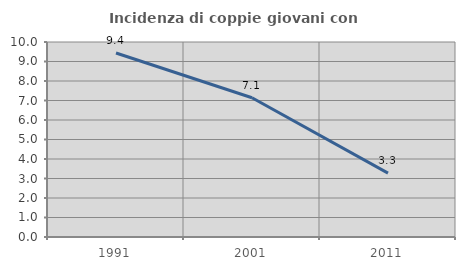
| Category | Incidenza di coppie giovani con figli |
|---|---|
| 1991.0 | 9.434 |
| 2001.0 | 7.143 |
| 2011.0 | 3.279 |